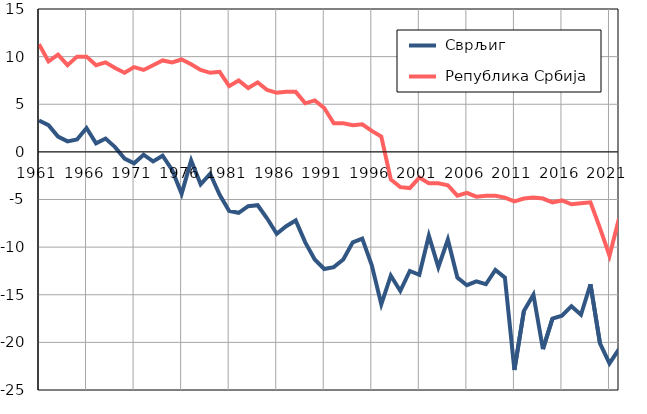
| Category |  Сврљиг |  Република Србија |
|---|---|---|
| 1961.0 | 3.3 | 11.3 |
| 1962.0 | 2.8 | 9.5 |
| 1963.0 | 1.6 | 10.2 |
| 1964.0 | 1.1 | 9.1 |
| 1965.0 | 1.3 | 10 |
| 1966.0 | 2.5 | 10 |
| 1967.0 | 0.9 | 9.1 |
| 1968.0 | 1.4 | 9.4 |
| 1969.0 | 0.5 | 8.8 |
| 1970.0 | -0.7 | 8.3 |
| 1971.0 | -1.2 | 8.9 |
| 1972.0 | -0.3 | 8.6 |
| 1973.0 | -1 | 9.1 |
| 1974.0 | -0.4 | 9.6 |
| 1975.0 | -1.9 | 9.4 |
| 1976.0 | -4.4 | 9.7 |
| 1977.0 | -0.9 | 9.2 |
| 1978.0 | -3.4 | 8.6 |
| 1979.0 | -2.3 | 8.3 |
| 1980.0 | -4.5 | 8.4 |
| 1981.0 | -6.2 | 6.9 |
| 1982.0 | -6.4 | 7.5 |
| 1983.0 | -5.7 | 6.7 |
| 1984.0 | -5.6 | 7.3 |
| 1985.0 | -7 | 6.5 |
| 1986.0 | -8.6 | 6.2 |
| 1987.0 | -7.8 | 6.3 |
| 1988.0 | -7.2 | 6.3 |
| 1989.0 | -9.5 | 5.1 |
| 1990.0 | -11.3 | 5.4 |
| 1991.0 | -12.3 | 4.6 |
| 1992.0 | -12.1 | 3 |
| 1993.0 | -11.3 | 3 |
| 1994.0 | -9.5 | 2.8 |
| 1995.0 | -9.1 | 2.9 |
| 1996.0 | -11.9 | 2.2 |
| 1997.0 | -16 | 1.6 |
| 1998.0 | -13 | -2.9 |
| 1999.0 | -14.6 | -3.7 |
| 2000.0 | -12.5 | -3.8 |
| 2001.0 | -12.9 | -2.7 |
| 2002.0 | -8.8 | -3.3 |
| 2003.0 | -12.1 | -3.3 |
| 2004.0 | -9.2 | -3.5 |
| 2005.0 | -13.2 | -4.6 |
| 2006.0 | -14 | -4.3 |
| 2007.0 | -13.6 | -4.7 |
| 2008.0 | -13.9 | -4.6 |
| 2009.0 | -12.4 | -4.6 |
| 2010.0 | -13.2 | -4.8 |
| 2011.0 | -22.9 | -5.2 |
| 2012.0 | -16.7 | -4.9 |
| 2013.0 | -15 | -4.8 |
| 2014.0 | -20.7 | -4.9 |
| 2015.0 | -17.5 | -5.3 |
| 2016.0 | -17.2 | -5.1 |
| 2017.0 | -16.2 | -5.5 |
| 2018.0 | -17.1 | -5.4 |
| 2019.0 | -13.9 | -5.3 |
| 2020.0 | -20.1 | -8 |
| 2021.0 | -22.2 | -10.9 |
| 2022.0 | -20.7 | -7 |